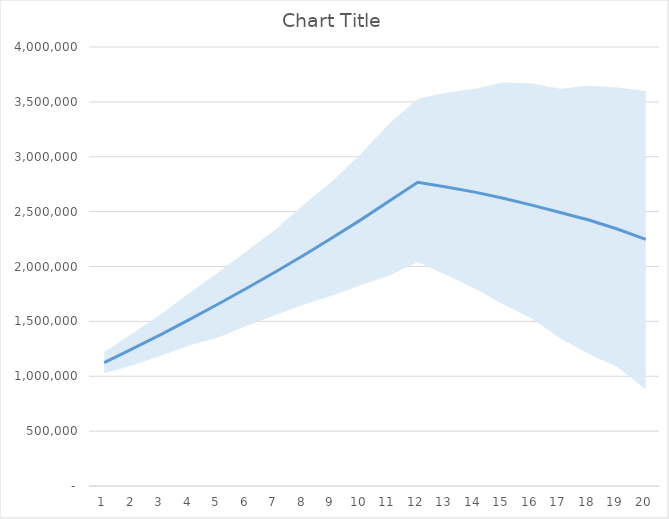
| Category | Series 0 |
|---|---|
| 0 | 1124000.779 |
| 1 | 1251598.373 |
| 2 | 1382073.446 |
| 3 | 1518583.613 |
| 4 | 1658507.916 |
| 5 | 1802049.593 |
| 6 | 1949263.792 |
| 7 | 2102518.608 |
| 8 | 2261154.416 |
| 9 | 2424951.773 |
| 10 | 2596681.713 |
| 11 | 2766682.958 |
| 12 | 2724776.537 |
| 13 | 2677607.973 |
| 14 | 2621297.123 |
| 15 | 2559446.125 |
| 16 | 2492503.055 |
| 17 | 2424036.552 |
| 18 | 2341485.184 |
| 19 | 2247365.907 |